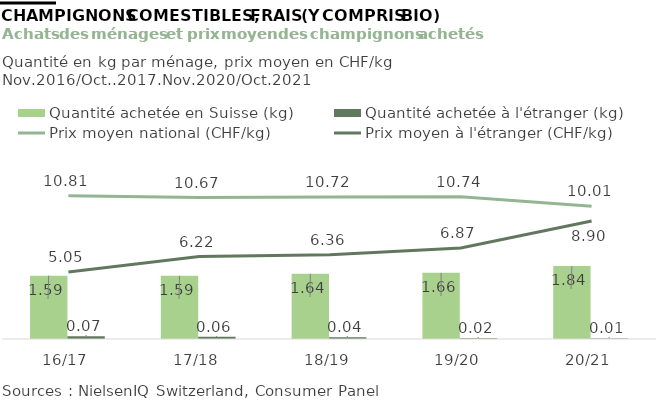
| Category | Quantité achetée en Suisse (kg) | Quantité achetée à l'étranger (kg) |
|---|---|---|
| 16/17 | 1.593 | 0.07 |
| 17/18 | 1.591 | 0.057 |
| 18/19 | 1.642 | 0.041 |
| 19/20 | 1.664 | 0.021 |
| 20/21 | 1.837 | 0.014 |